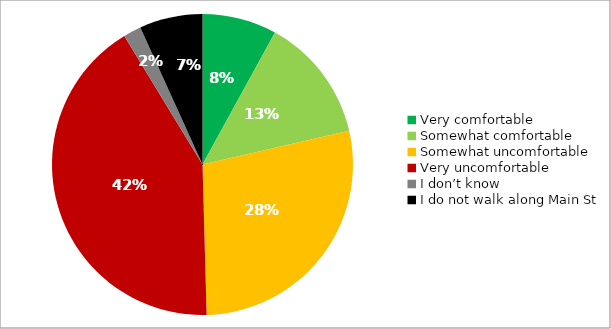
| Category | Responses |
|---|---|
| Very comfortable | 0.08 |
| Somewhat comfortable | 0.134 |
| Somewhat uncomfortable | 0.282 |
| Very uncomfortable | 0.417 |
| I don’t know | 0.019 |
| I do not walk along Main St | 0.068 |